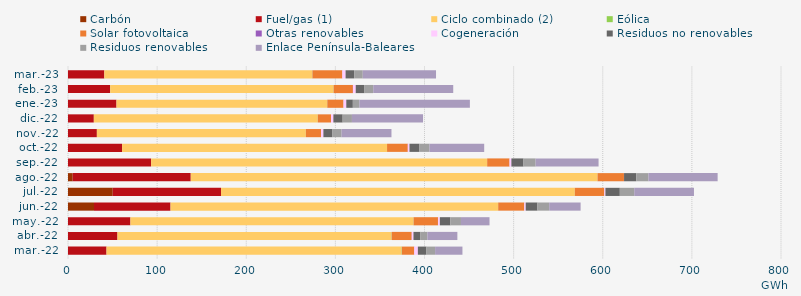
| Category | Carbón | Fuel/gas (1) | Ciclo combinado (2) | Eólica | Solar fotovoltaica | Otras renovables | Cogeneración | Residuos no renovables | Residuos renovables | Enlace Península-Baleares |
|---|---|---|---|---|---|---|---|---|---|---|
| mar.-22 | -0.669 | 43.218 | 331.001 | 0.338 | 13.718 | 0.291 | 3.993 | 9.663 | 9.663 | 30.689 |
| abr.-22 | -0.605 | 55.507 | 307.429 | 0.24 | 22.444 | 0.165 | 1.839 | 7.805 | 7.805 | 33.641 |
| may.-22 | -1.03 | 70.043 | 317.556 | 0.161 | 27.347 | 0.166 | 1.946 | 11.846 | 11.846 | 32.047 |
| jun.-22 | 29.142 | 85.898 | 367.588 | 0.061 | 29.226 | 0.111 | 1.536 | 13.186 | 13.186 | 35.225 |
| jul.-22 | 50.189 | 121.497 | 396.96 | 0.03 | 33.05 | 0.095 | 1.172 | 16.161 | 16.161 | 67.033 |
| ago.-22 | 5.265 | 132.464 | 456.377 | 0.032 | 29.653 | 0.057 | 0.051 | 13.672 | 13.672 | 77.653 |
| sep.-22 | -0.604 | 93.246 | 377.074 | 0.013 | 25.056 | 0.072 | 2.037 | 13.582 | 13.582 | 70.647 |
| oct.-22 | -0.613 | 60.669 | 297.321 | 0.003 | 23.236 | 0.097 | 1.827 | 11.231 | 11.231 | 61.365 |
| nov.-22 | -0.588 | 32.394 | 234.48 | 0.026 | 17.029 | 0.085 | 2.554 | 10.189 | 10.189 | 55.992 |
| dic.-22 | -0.627 | 28.98 | 251.185 | 0.101 | 14.8 | 0.077 | 2.62 | 10.414 | 10.414 | 79.779 |
| ene.-23 | -0.728 | 54.403 | 236.334 | 0.216 | 18.142 | 0.094 | 3.056 | 7.362 | 7.362 | 123.95 |
| feb.-23 | -0.707 | 47.337 | 250.507 | 0.183 | 21.622 | 0.136 | 3.052 | 9.83 | 9.83 | 89.734 |
| mar.-23 | -0.518 | 40.752 | 233.282 | 0.2 | 33.526 | 0.112 | 3.586 | 9.638 | 9.638 | 82.194 |